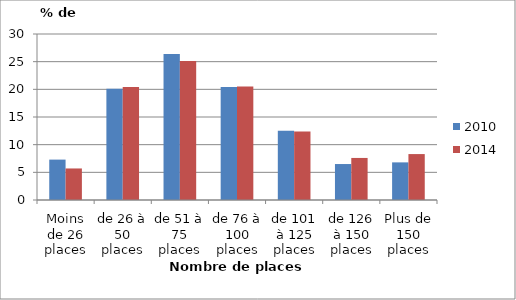
| Category | 2010 | 2014 |
|---|---|---|
| Moins de 26 places | 7.3 | 5.7 |
| de 26 à 50 places | 20.1 | 20.4 |
| de 51 à 75 places | 26.4 | 25.1 |
| de 76 à 100 places | 20.4 | 20.5 |
| de 101 à 125 places | 12.5 | 12.4 |
| de 126 à 150 places | 6.5 | 7.6 |
| Plus de 150 places | 6.8 | 8.3 |